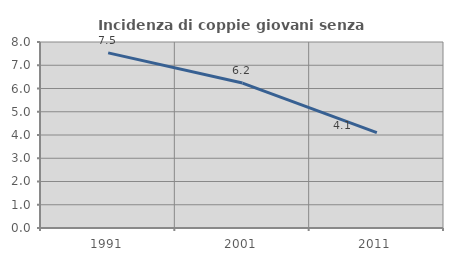
| Category | Incidenza di coppie giovani senza figli |
|---|---|
| 1991.0 | 7.531 |
| 2001.0 | 6.234 |
| 2011.0 | 4.105 |